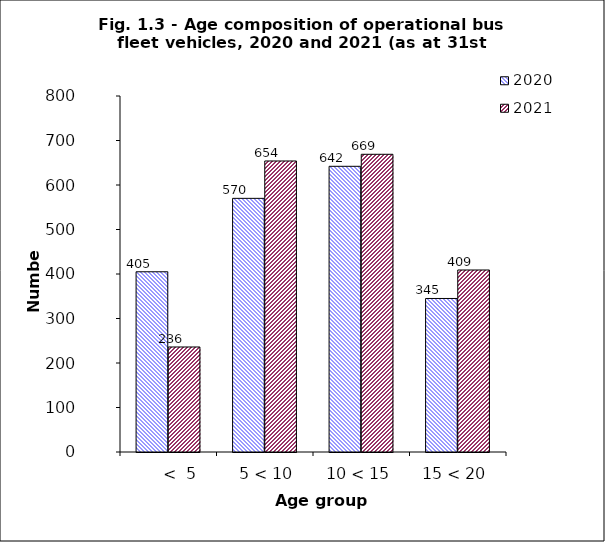
| Category | 2020 | 2021 |
|---|---|---|
|       <  5 | 405 | 236 |
|   5 < 10 | 570 | 654 |
| 10 < 15 | 642 | 669 |
| 15 < 20 | 345 | 409 |